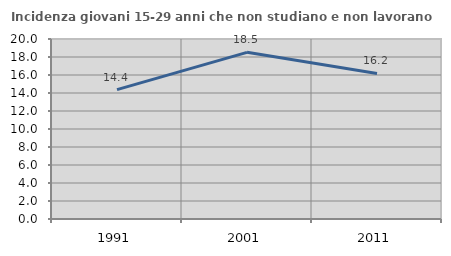
| Category | Incidenza giovani 15-29 anni che non studiano e non lavorano  |
|---|---|
| 1991.0 | 14.381 |
| 2001.0 | 18.519 |
| 2011.0 | 16.176 |